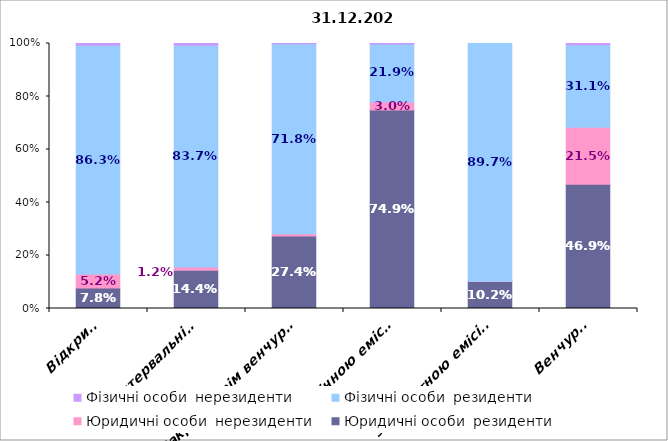
| Category | Юридичні особи  | Фізичні особи  |
|---|---|---|
| Відкриті | 0.052 | 0.006 |
| Інтервальні** | 0.012 | 0.006 |
| Закриті (крім венчурних), у т. ч.: | 0.008 | 0.001 |
| з публічною емісією | 0.03 | 0.002 |
| з приватною емісією | 0 | 0 |
| Венчурні | 0.215 | 0.005 |